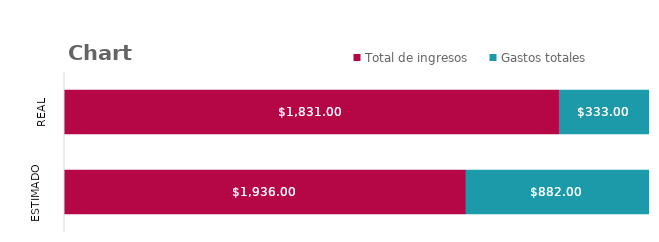
| Category | Total de ingresos | Gastos totales |
|---|---|---|
| Estimado | 1936 | 882 |
| Real | 1831 | 333 |